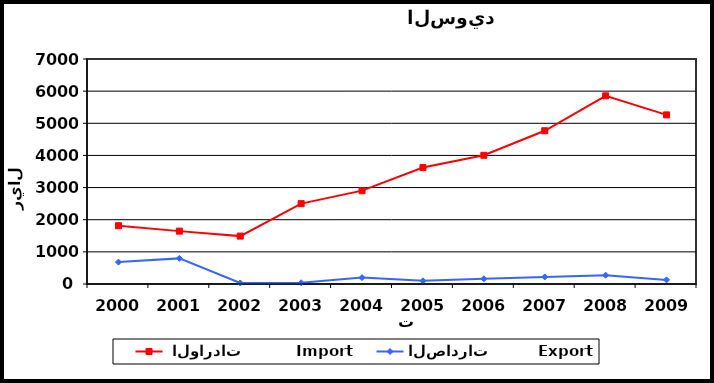
| Category |  الواردات           Import | الصادرات          Export |
|---|---|---|
| 2000.0 | 1813 | 682 |
| 2001.0 | 1645 | 797 |
| 2002.0 | 1490 | 32 |
| 2003.0 | 2500 | 38 |
| 2004.0 | 2904 | 199 |
| 2005.0 | 3622 | 99 |
| 2006.0 | 4004 | 163 |
| 2007.0 | 4768 | 219 |
| 2008.0 | 5854 | 275 |
| 2009.0 | 5261 | 128 |